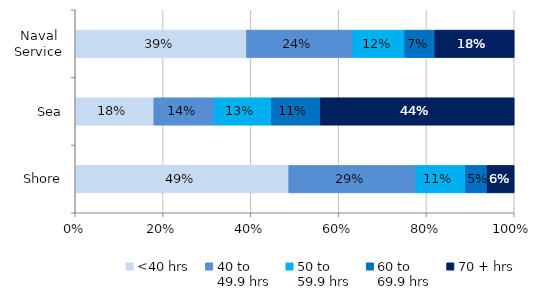
| Category | <40 hrs | 40 to 
49.9 hrs | 50 to 
59.9 hrs | 60 to 
69.9 hrs | 70 + hrs |
|---|---|---|---|---|---|
| Naval Service | 0.39 | 0.242 | 0.119 | 0.069 | 0.181 |
| Sea | 0.179 | 0.137 | 0.13 | 0.112 | 0.442 |
| Shore | 0.486 | 0.29 | 0.113 | 0.049 | 0.062 |